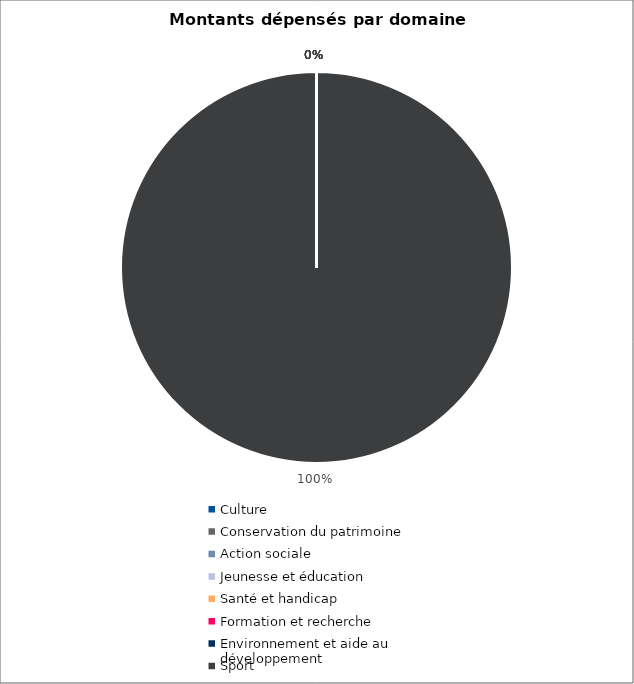
| Category | Series 0 |
|---|---|
| Culture | 0 |
| Conservation du patrimoine | 0 |
| Action sociale | 0 |
| Jeunesse et éducation | 0 |
| Santé et handicap | 0 |
| Formation et recherche | 0 |
| Environnement et aide au
développement | 0 |
| Sport | 978982.5 |
| Autres projets d’utilité publique | 0 |